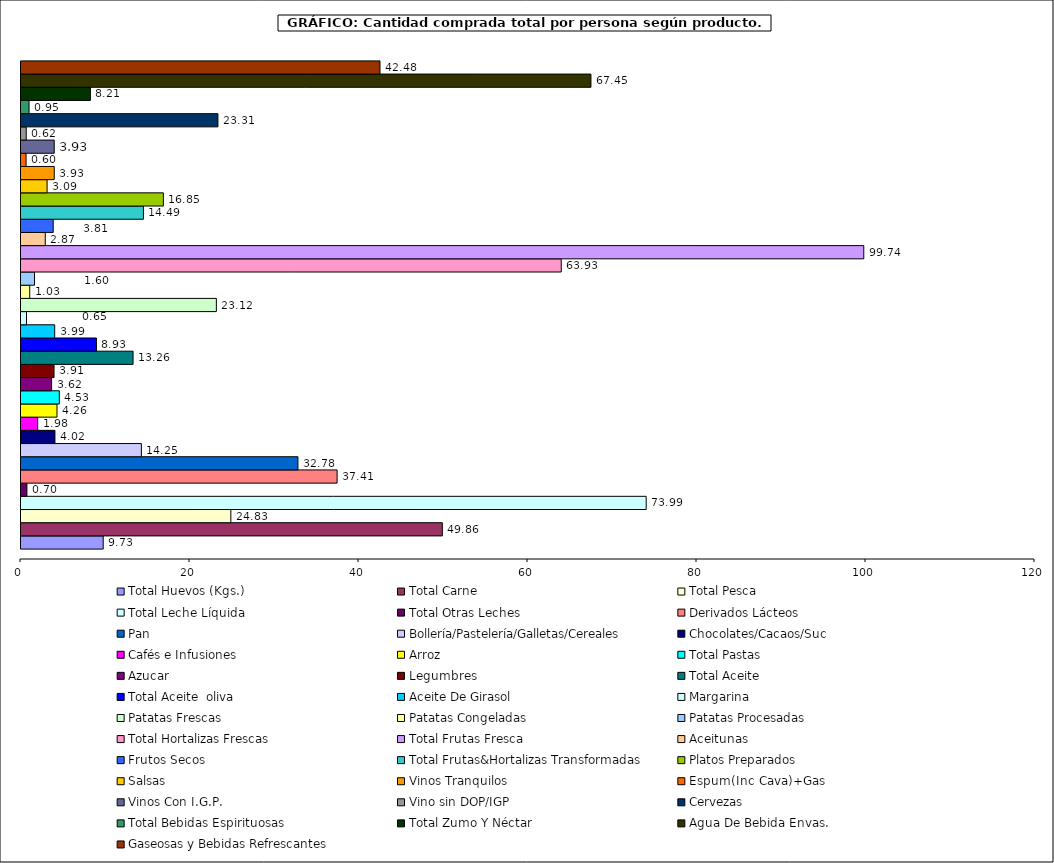
| Category | Total Huevos (Kgs.) | Total Carne | Total Pesca | Total Leche Líquida | Total Otras Leches | Derivados Lácteos | Pan | Bollería/Pastelería/Galletas/Cereales | Chocolates/Cacaos/Suc | Cafés e Infusiones | Arroz | Total Pastas | Azucar | Legumbres | Total Aceite | Total Aceite  oliva | Aceite De Girasol | Margarina | Patatas Frescas | Patatas Congeladas | Patatas Procesadas | Total Hortalizas Frescas | Total Frutas Fresca | Aceitunas | Frutos Secos | Total Frutas&Hortalizas Transformadas | Platos Preparados | Salsas | Vinos Tranquilos | Espum(Inc Cava)+Gas | Vinos Con I.G.P. | Vino sin DOP/IGP | Cervezas | Total Bebidas Espirituosas  | Total Zumo Y Néctar | Agua De Bebida Envas. | Gaseosas y Bebidas Refrescantes |
|---|---|---|---|---|---|---|---|---|---|---|---|---|---|---|---|---|---|---|---|---|---|---|---|---|---|---|---|---|---|---|---|---|---|---|---|---|---|
| 0 | 9.728 | 49.862 | 24.835 | 73.987 | 0.701 | 37.408 | 32.775 | 14.246 | 4.016 | 1.976 | 4.26 | 4.534 | 3.624 | 3.911 | 13.262 | 8.926 | 3.989 | 0.652 | 23.121 | 1.034 | 1.598 | 63.934 | 99.738 | 2.872 | 3.813 | 14.49 | 16.849 | 3.089 | 3.933 | 0.6 | 3.934 | 0.621 | 23.305 | 0.953 | 8.212 | 67.449 | 42.485 |